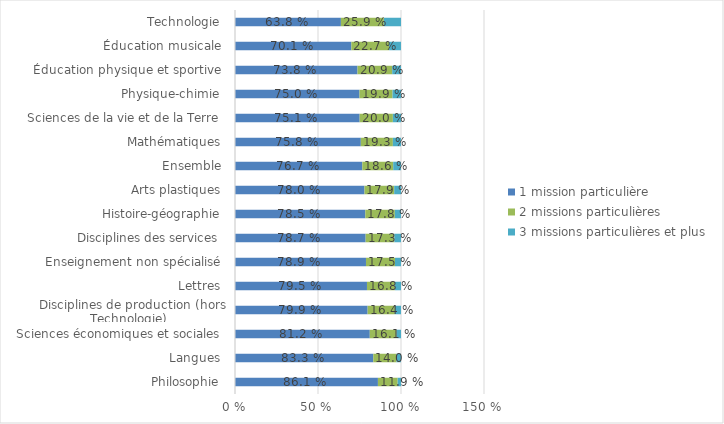
| Category | 1 mission particulière | 2 missions particulières | 3 missions particulières et plus |
|---|---|---|---|
| Philosophie | 0.861 | 0.119 | 0.02 |
| Langues | 0.833 | 0.14 | 0.027 |
| Sciences économiques et sociales | 0.812 | 0.161 | 0.027 |
| Disciplines de production (hors Technologie) | 0.799 | 0.164 | 0.037 |
| Lettres | 0.795 | 0.168 | 0.037 |
| Enseignement non spécialisé | 0.789 | 0.175 | 0.036 |
| Disciplines des services | 0.787 | 0.173 | 0.04 |
| Histoire-géographie | 0.785 | 0.178 | 0.037 |
| Arts plastiques | 0.78 | 0.179 | 0.041 |
| Ensemble | 0.767 | 0.186 | 0.047 |
| Mathématiques | 0.758 | 0.193 | 0.049 |
| Sciences de la vie et de la Terre | 0.751 | 0.2 | 0.049 |
| Physique-chimie | 0.75 | 0.199 | 0.051 |
| Éducation physique et sportive | 0.738 | 0.209 | 0.053 |
| Éducation musicale | 0.701 | 0.227 | 0.072 |
| Technologie | 0.638 | 0.259 | 0.103 |